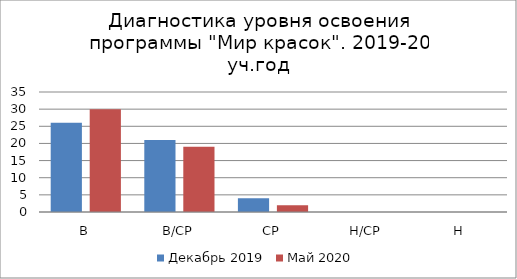
| Category | Декабрь 2019 | Май 2020 |
|---|---|---|
| В | 26 | 30 |
| В/СР | 21 | 19 |
| СР | 4 | 2 |
| Н/СР | 0 | 0 |
| Н | 0 | 0 |